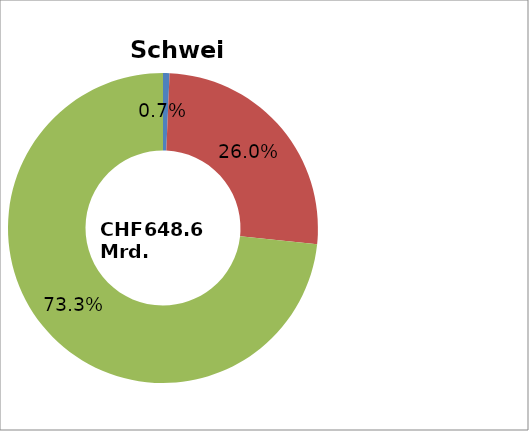
| Category | Schweiz |
|---|---|
| Sektor 1 Landwirtschaft | 0.007 |
| Sektor 2 Industrie | 0.26 |
| Sektor 3 Dienstleistungen | 0.733 |